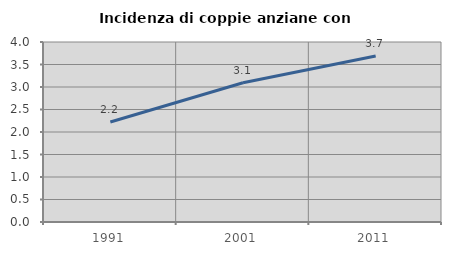
| Category | Incidenza di coppie anziane con figli |
|---|---|
| 1991.0 | 2.222 |
| 2001.0 | 3.094 |
| 2011.0 | 3.688 |